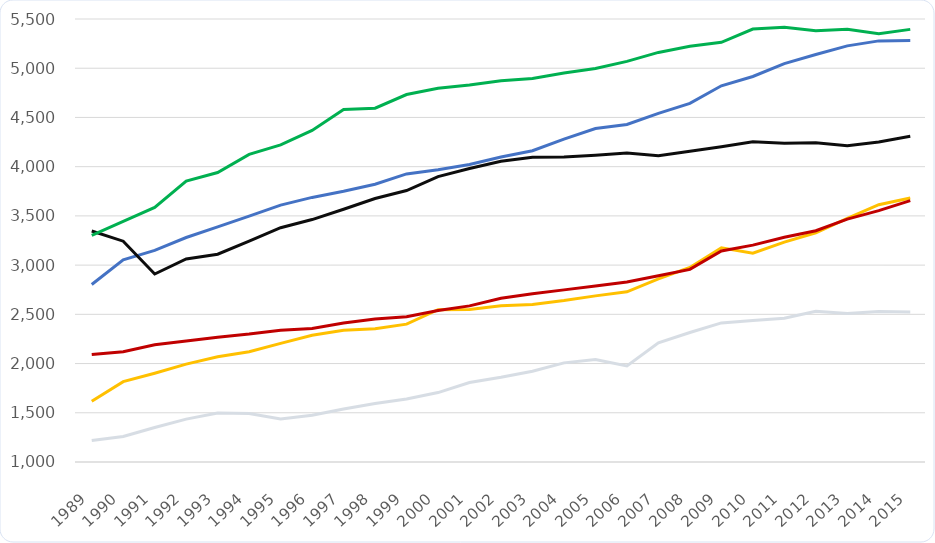
| Category | FRA | GER | ITA | SPA | UK | US |
|---|---|---|---|---|---|---|
| 1989 | 2802.934 | 3346.515 | 3302.958 | 1616.248 | 1217.619 | 2092.325 |
| 1990 | 3054.321 | 3242.993 | 3443.334 | 1816.237 | 1258.647 | 2120.913 |
| 1991 | 3149.351 | 2909.919 | 3586.008 | 1901.828 | 1350.097 | 2190.414 |
| 1992 | 3280.589 | 3062.664 | 3854.449 | 1993.954 | 1435.305 | 2229.149 |
| 1993 | 3388.422 | 3110.546 | 3940.215 | 2068.522 | 1496.569 | 2268.286 |
| 1994 | 3498.062 | 3243.28 | 4124.742 | 2119.996 | 1493.114 | 2299.144 |
| 1995 | 3609.412 | 3379.753 | 4221.512 | 2204.738 | 1436.329 | 2337.563 |
| 1996 | 3687.67 | 3462.615 | 4367.779 | 2286.586 | 1474.841 | 2355.74 |
| 1997 | 3750.693 | 3567.306 | 4581.83 | 2337.711 | 1537.453 | 2412.254 |
| 1998 | 3821.451 | 3676.566 | 4593.813 | 2352.576 | 1594.127 | 2451.575 |
| 1999 | 3926.371 | 3757.337 | 4732.596 | 2400.275 | 1640.578 | 2474.952 |
| 2000 | 3968.678 | 3899.263 | 4796.662 | 2547.334 | 1705.017 | 2538.529 |
| 2001 | 4021.862 | 3980.579 | 4828.822 | 2548.071 | 1806.908 | 2585.978 |
| 2002 | 4098.161 | 4054.04 | 4873.62 | 2588.219 | 1860.071 | 2662.77 |
| 2003 | 4161.436 | 4096.332 | 4896.063 | 2600.661 | 1921.319 | 2708.177 |
| 2004 | 4280.549 | 4097.95 | 4950.832 | 2640.142 | 2006.868 | 2748.568 |
| 2005 | 4386.94 | 4116.572 | 4996.361 | 2687.519 | 2040.955 | 2787.129 |
| 2006 | 4428.573 | 4138.705 | 5069.699 | 2728.785 | 1975.654 | 2827.761 |
| 2007 | 4542.092 | 4111.283 | 5160.573 | 2859.716 | 2211.208 | 2892.688 |
| 2008 | 4642.354 | 4156.457 | 5224.144 | 2975.986 | 2315.215 | 2956.93 |
| 2009 | 4821.5 | 4202.755 | 5263.642 | 3175.944 | 2413.032 | 3144.314 |
| 2010 | 4915.844 | 4252.092 | 5397.905 | 3120.11 | 2438.106 | 3202.793 |
| 2011 | 5046.98 | 4236.967 | 5416.05 | 3233.849 | 2459.731 | 3282.391 |
| 2012 | 5139.538 | 4242.763 | 5379.886 | 3328.486 | 2530.7 | 3349.028 |
| 2013 | 5226.959 | 4212.747 | 5396.952 | 3474.005 | 2508.074 | 3467.201 |
| 2014 | 5277.676 | 4251.143 | 5349.148 | 3613.647 | 2528.178 | 3553.22 |
| 2015 | 5281.132 | 4308.859 | 5394.681 | 3680.974 | 2524.83 | 3655.107 |